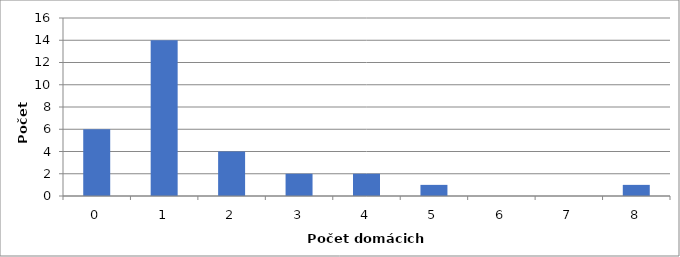
| Category | Series 0 |
|---|---|
| 0.0 | 6 |
| 1.0 | 14 |
| 2.0 | 4 |
| 3.0 | 2 |
| 4.0 | 2 |
| 5.0 | 1 |
| 6.0 | 0 |
| 7.0 | 0 |
| 8.0 | 1 |